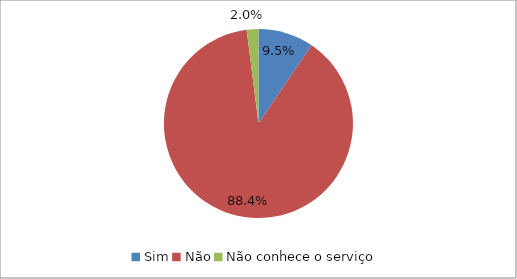
| Category | Series 0 |
|---|---|
| Sim | 0.095 |
| Não | 0.884 |
| Não conhece o serviço | 0.02 |